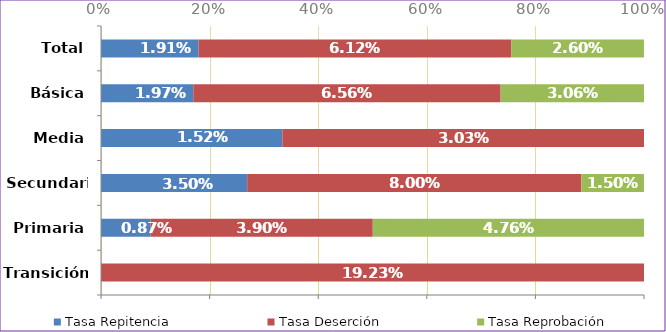
| Category | Tasa Repitencia | Tasa Deserción | Tasa Reprobación |
|---|---|---|---|
| Transición | 0 | 0.192 | 0 |
| Primaria | 0.009 | 0.039 | 0.048 |
| Secundaria | 0.035 | 0.08 | 0.015 |
| Media | 0.015 | 0.03 | 0 |
| Básica | 0.02 | 0.066 | 0.031 |
| Total | 0.019 | 0.061 | 0.026 |